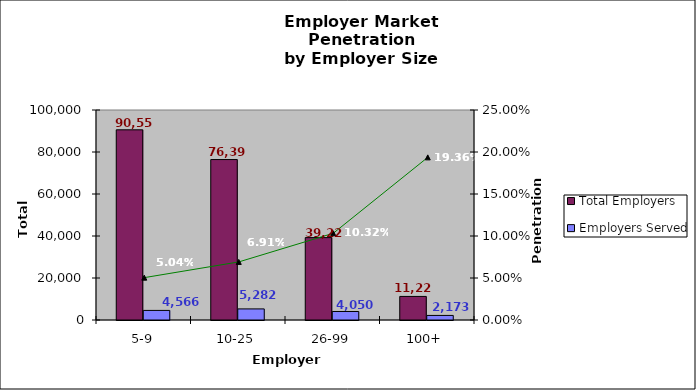
| Category | Total Employers | Employers Served |
|---|---|---|
| 5-9 | 90559 | 4566 |
| 10-25 | 76399 | 5282 |
| 26-99 | 39228 | 4050 |
| 100+ | 11224 | 2173 |